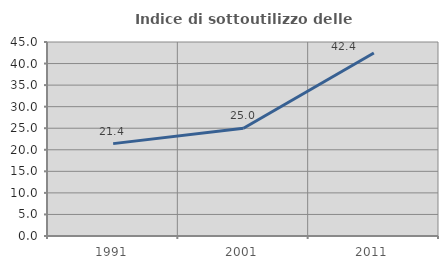
| Category | Indice di sottoutilizzo delle abitazioni  |
|---|---|
| 1991.0 | 21.429 |
| 2001.0 | 25 |
| 2011.0 | 42.446 |